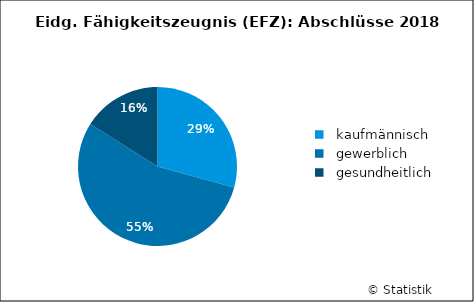
| Category | Series 0 |
|---|---|
|   kaufmännisch | 1390 |
|   gewerblich | 2601 |
|   gesundheitlich | 760 |